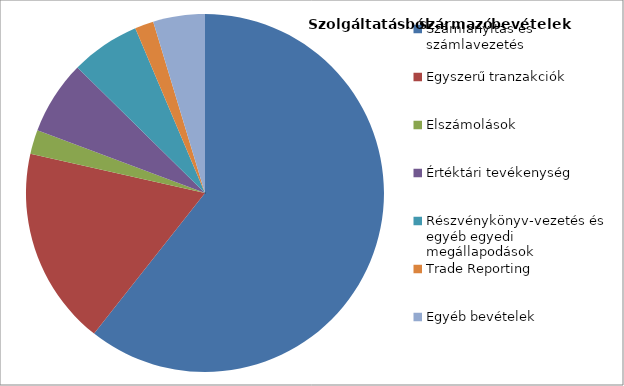
| Category | Series 0 |
|---|---|
| Számlanyitás és számlavezetés | 2424.7 |
| Egyszerű tranzakciók | 715.3 |
| Elszámolások | 87.3 |
| Értéktári tevékenység | 266.6 |
| Részvénykönyv-vezetés és egyéb egyedi megállapodások | 250.2 |
| Trade Reporting | 67.8 |
| Egyéb bevételek | 186.8 |